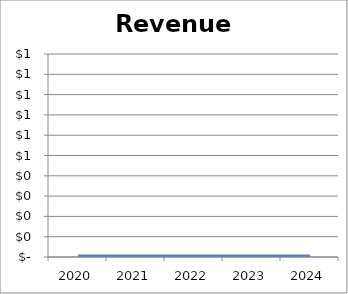
| Category | Revenues |
|---|---|
| 2020.0 | 0 |
| 2021.0 | 0 |
| 2022.0 | 0 |
| 2023.0 | 0 |
| 2024.0 | 0 |